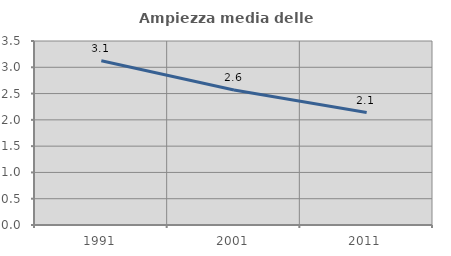
| Category | Ampiezza media delle famiglie |
|---|---|
| 1991.0 | 3.123 |
| 2001.0 | 2.569 |
| 2011.0 | 2.138 |